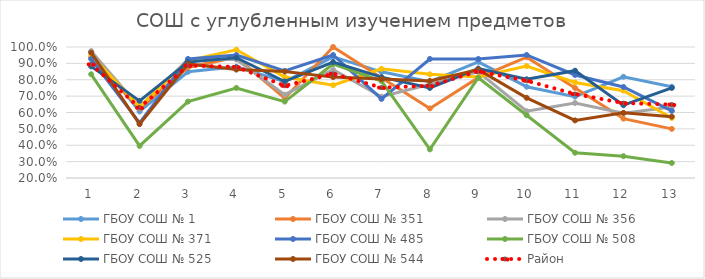
| Category | ГБОУ СОШ № 1 | ГБОУ СОШ № 351 | ГБОУ СОШ № 356 | ГБОУ СОШ № 371 | ГБОУ СОШ № 485 | ГБОУ СОШ № 508 | ГБОУ СОШ № 525 | ГБОУ СОШ № 544 | Район |
|---|---|---|---|---|---|---|---|---|---|
| 0 | 0.97 | 0.938 | 0.975 | 0.95 | 0.927 | 0.833 | 0.882 | 0.966 | 0.894 |
| 1 | 0.606 | 0.625 | 0.633 | 0.633 | 0.537 | 0.396 | 0.671 | 0.529 | 0.63 |
| 2 | 0.848 | 0.875 | 0.924 | 0.917 | 0.927 | 0.667 | 0.908 | 0.897 | 0.887 |
| 3 | 0.879 | 0.938 | 0.924 | 0.983 | 0.951 | 0.75 | 0.934 | 0.862 | 0.879 |
| 4 | 0.788 | 0.688 | 0.709 | 0.817 | 0.854 | 0.667 | 0.789 | 0.851 | 0.763 |
| 5 | 0.939 | 1 | 0.861 | 0.767 | 0.951 | 0.896 | 0.908 | 0.816 | 0.836 |
| 6 | 0.848 | 0.812 | 0.696 | 0.867 | 0.683 | 0.792 | 0.816 | 0.805 | 0.752 |
| 7 | 0.788 | 0.625 | 0.772 | 0.833 | 0.927 | 0.375 | 0.75 | 0.793 | 0.763 |
| 8 | 0.909 | 0.812 | 0.848 | 0.817 | 0.927 | 0.812 | 0.868 | 0.862 | 0.851 |
| 9 | 0.758 | 0.938 | 0.608 | 0.883 | 0.951 | 0.583 | 0.803 | 0.69 | 0.794 |
| 10 | 0.697 | 0.75 | 0.658 | 0.783 | 0.829 | 0.354 | 0.855 | 0.552 | 0.713 |
| 11 | 0.818 | 0.562 | 0.595 | 0.733 | 0.756 | 0.333 | 0.645 | 0.598 | 0.658 |
| 12 | 0.758 | 0.5 | 0.633 | 0.567 | 0.61 | 0.292 | 0.75 | 0.575 | 0.649 |